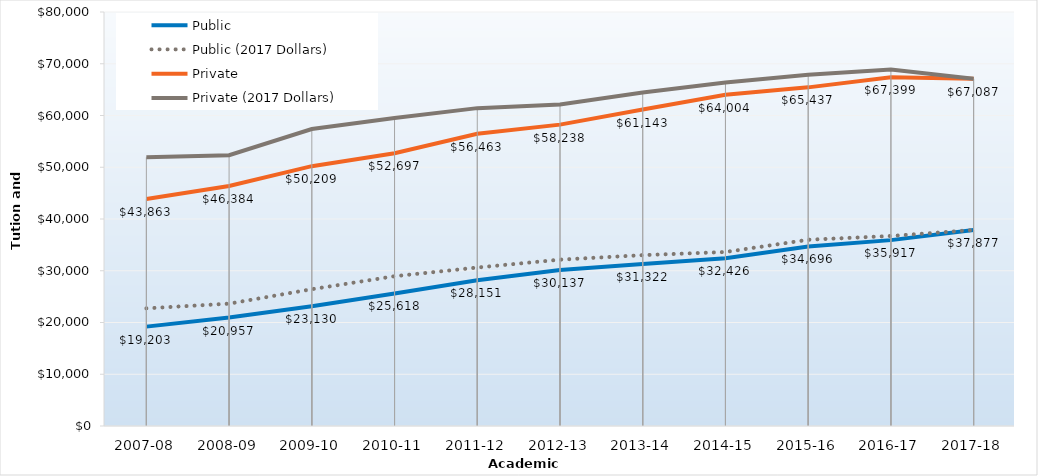
| Category | Public | Public (2017 Dollars) | Private | Private (2017 Dollars) |
|---|---|---|---|---|
| 2007-08 | 19203 | 22733.3 | 43863 | 51926.82 |
| 2008-09 | 20957 | 23642.54 | 46384 | 52327.89 |
| 2009-10 | 23130 | 26434 | 50209 | 57381.08 |
| 2010-11 | 25618 | 28946.34 | 52697 | 59532.19 |
| 2011-12 | 28151 | 30623.79 | 56463 | 61422.73 |
| 2012-13 | 30137 | 32144.16 | 58238 | 62116.72 |
| 2013-14 | 31322 | 33016.86 | 61143 | 64451.5 |
| 2014-15 | 32426 | 33623.15 | 64004 | 66367 |
| 2015-16 | 34695.56 | 35989.96 | 65437.27 | 67877.43 |
| 2016-17 | 35916.95 | 36719.01 | 67398.89 | 68904 |
| 2017-18 | 37877.21 | 37877.21 | 67086.74 | 67086.74 |